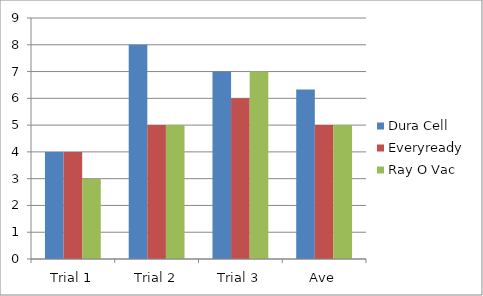
| Category | Dura Cell | Everyready | Ray O Vac |
|---|---|---|---|
| Trial 1 | 4 | 4 | 3 |
| Trial 2 | 8 | 5 | 5 |
| Trial 3 | 7 | 6 | 7 |
| Ave | 6.333 | 5 | 5 |